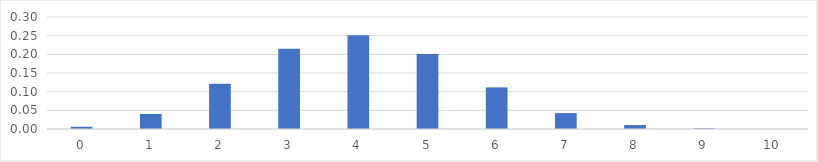
| Category | Series 0 |
|---|---|
| 0.0 | 0.006 |
| 1.0 | 0.04 |
| 2.0 | 0.121 |
| 3.0 | 0.215 |
| 4.0 | 0.251 |
| 5.0 | 0.201 |
| 6.0 | 0.111 |
| 7.0 | 0.042 |
| 8.0 | 0.011 |
| 9.0 | 0.002 |
| 10.0 | 0 |